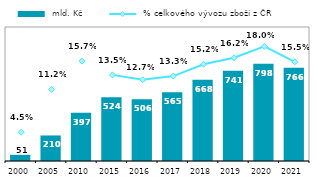
| Category |  mld. Kč |
|---|---|
| 2000 | 50.504 |
| 2005 | 209.61 |
| 2010 | 396.641 |
| 2015 | 524.063 |
| 2016 | 506.27 |
| 2017 | 564.76 |
| 2018 | 667.983 |
| 2019 | 740.78 |
| 2020 | 798.057 |
| 2021 | 766.23 |